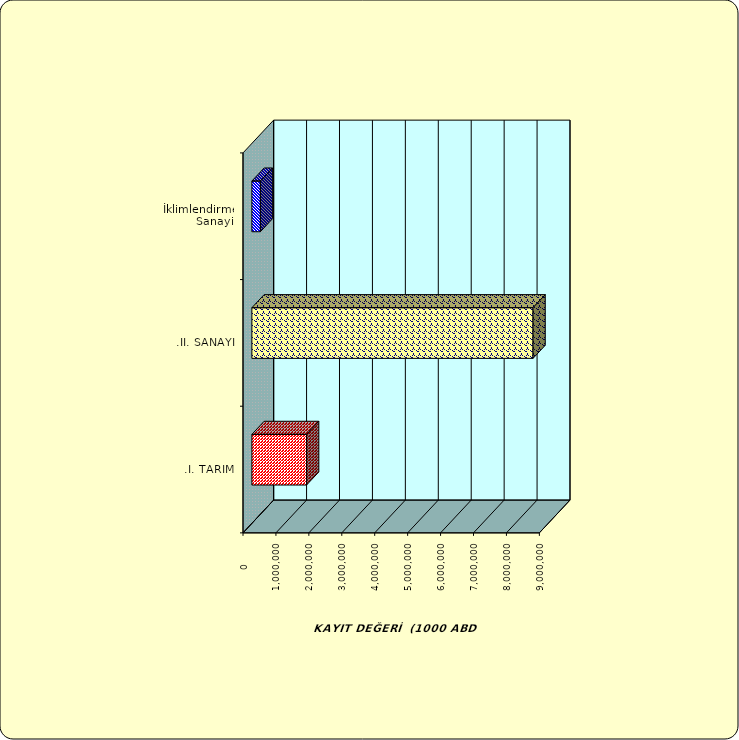
| Category | Series 0 |
|---|---|
| .I. TARIM | 1661215.975 |
| .II. SANAYİ | 8538110.638 |
|  İklimlendirme Sanayii | 258522.519 |